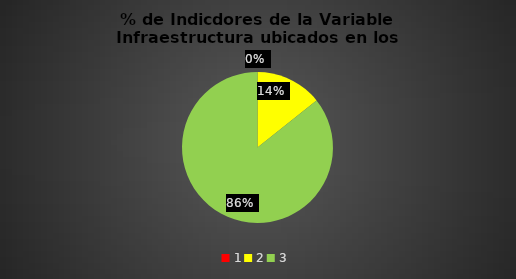
| Category | Series 0 |
|---|---|
| 0 | 0 |
| 1 | 0.143 |
| 2 | 0.857 |